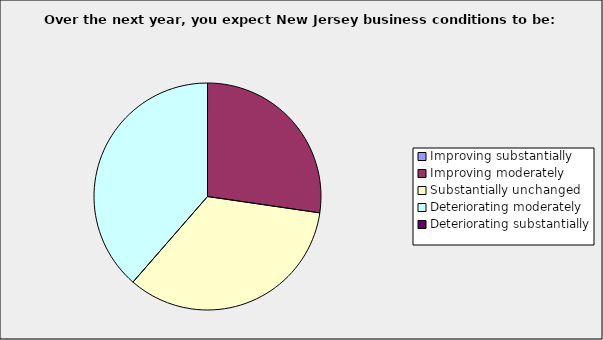
| Category | Series 0 |
|---|---|
| Improving substantially | 0 |
| Improving moderately | 0.273 |
| Substantially unchanged | 0.341 |
| Deteriorating moderately | 0.386 |
| Deteriorating substantially | 0 |